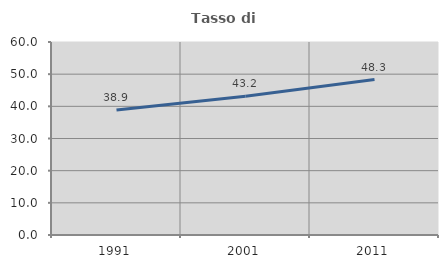
| Category | Tasso di occupazione   |
|---|---|
| 1991.0 | 38.869 |
| 2001.0 | 43.159 |
| 2011.0 | 48.335 |